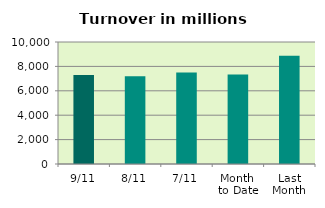
| Category | Series 0 |
|---|---|
| 9/11 | 7301.023 |
| 8/11 | 7195.486 |
| 7/11 | 7498.163 |
| Month 
to Date | 7343.726 |
| Last
Month | 8866.758 |